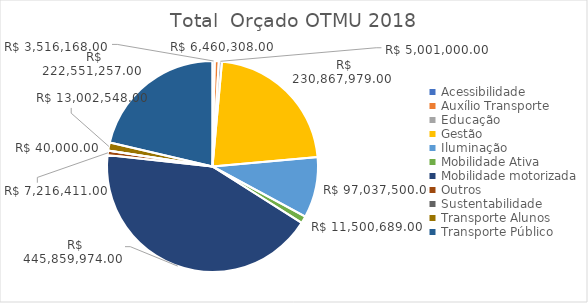
| Category | Soma de valor_orcado |
|---|---|
| Acessibilidade | 3516168 |
| Auxílio Transporte | 6460308 |
| Educação | 5001000 |
| Gestão | 230867979 |
| Iluminação | 97037500 |
| Mobilidade Ativa | 11500689 |
| Mobilidade motorizada | 445859974 |
| Outros | 7216411 |
| Sustentabilidade | 40000 |
| Transporte Alunos | 13002548 |
| Transporte Público | 222551257 |